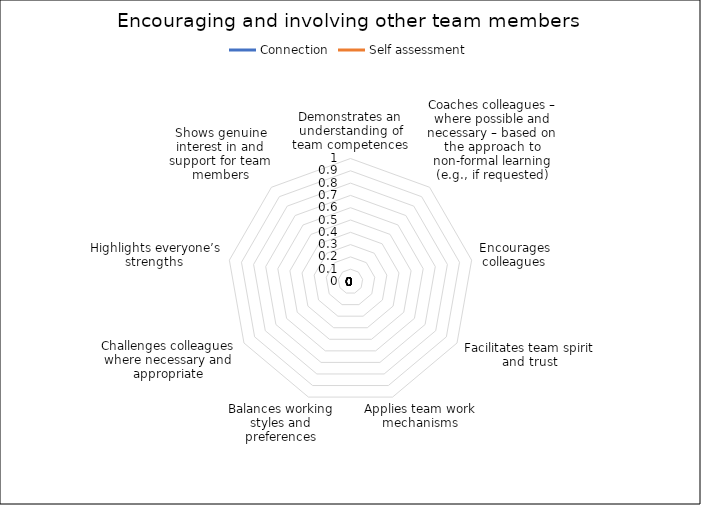
| Category | Connection | Self assessment |
|---|---|---|
| Demonstrates an understanding of team competences | 0 | 0 |
| Coaches colleagues – where possible and necessary – based on the approach to non-formal learning (e.g., if requested) | 0 | 0 |
| Encourages colleagues | 0 | 0 |
| Facilitates team spirit and trust | 0 | 0 |
| Applies team work mechanisms | 0 | 0 |
| Balances working styles and preferences | 0 | 0 |
| Challenges colleagues where necessary and appropriate | 0 | 0 |
| Highlights everyone’s strengths  | 0 | 0 |
| Shows genuine interest in and support for team members | 0 | 0 |